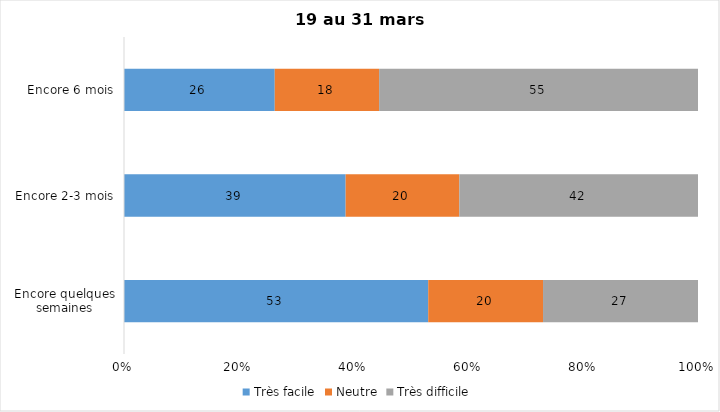
| Category | Très facile | Neutre | Très difficile |
|---|---|---|---|
| Encore quelques semaines | 53 | 20 | 27 |
| Encore 2-3 mois | 39 | 20 | 42 |
| Encore 6 mois | 26 | 18 | 55 |